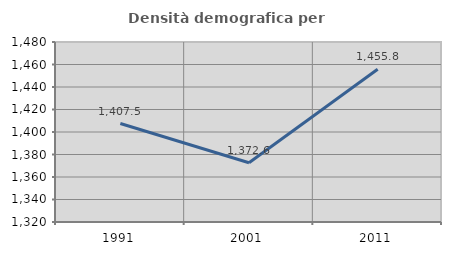
| Category | Densità demografica |
|---|---|
| 1991.0 | 1407.527 |
| 2001.0 | 1372.65 |
| 2011.0 | 1455.841 |